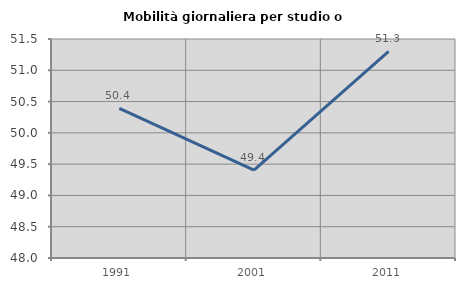
| Category | Mobilità giornaliera per studio o lavoro |
|---|---|
| 1991.0 | 50.392 |
| 2001.0 | 49.404 |
| 2011.0 | 51.302 |